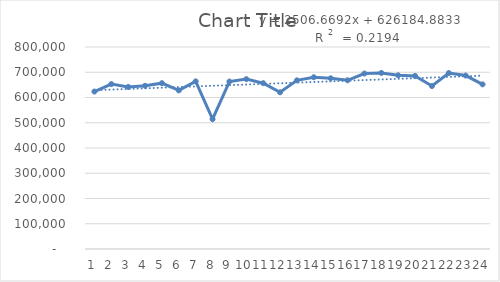
| Category | Series 0 |
|---|---|
| 0 | 623470.68 |
| 1 | 652998.64 |
| 2 | 641910.64 |
| 3 | 646442.16 |
| 4 | 656752.32 |
| 5 | 628087.6 |
| 6 | 663972.68 |
| 7 | 514357.76 |
| 8 | 663150.88 |
| 9 | 672749.56 |
| 10 | 656712.56 |
| 11 | 620594.8 |
| 12 | 667997.96 |
| 13 | 680250.76 |
| 14 | 676093.6 |
| 15 | 668016.16 |
| 16 | 694925.84 |
| 17 | 697350.36 |
| 18 | 687885.8 |
| 19 | 685493.76 |
| 20 | 645394.4 |
| 21 | 696886.4 |
| 22 | 686916.16 |
| 23 | 652026.48 |